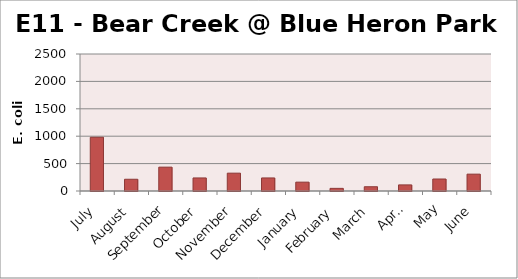
| Category | E. coli MPN |
|---|---|
| July | 980.4 |
| August | 214.2 |
| September | 435.2 |
| October | 238.2 |
| November | 325.5 |
| December | 238.2 |
| January | 161.6 |
| February | 48.1 |
| March | 77.6 |
| April | 111.2 |
| May | 218.7 |
| June | 307.6 |